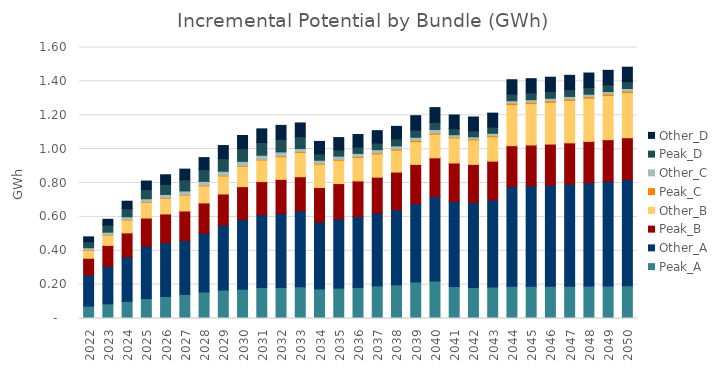
| Category | Peak_A | Other_A | Peak_B | Other_B | Peak_C | Other_C | Peak_D | Other_D |
|---|---|---|---|---|---|---|---|---|
| 2022.0 | 0.074 | 0.183 | 0.099 | 0.047 | 0.002 | 0.013 | 0.035 | 0.029 |
| 2023.0 | 0.087 | 0.221 | 0.124 | 0.06 | 0.002 | 0.015 | 0.042 | 0.034 |
| 2024.0 | 0.101 | 0.262 | 0.142 | 0.076 | 0.003 | 0.017 | 0.048 | 0.044 |
| 2025.0 | 0.118 | 0.309 | 0.166 | 0.092 | 0.003 | 0.019 | 0.054 | 0.05 |
| 2026.0 | 0.13 | 0.318 | 0.17 | 0.092 | 0.003 | 0.02 | 0.06 | 0.057 |
| 2027.0 | 0.142 | 0.318 | 0.174 | 0.093 | 0.004 | 0.021 | 0.065 | 0.064 |
| 2028.0 | 0.157 | 0.348 | 0.178 | 0.101 | 0.004 | 0.023 | 0.07 | 0.071 |
| 2029.0 | 0.168 | 0.384 | 0.183 | 0.106 | 0.004 | 0.024 | 0.075 | 0.077 |
| 2030.0 | 0.173 | 0.411 | 0.194 | 0.121 | 0.004 | 0.024 | 0.075 | 0.078 |
| 2031.0 | 0.183 | 0.43 | 0.196 | 0.127 | 0.005 | 0.024 | 0.075 | 0.081 |
| 2032.0 | 0.183 | 0.437 | 0.201 | 0.133 | 0.005 | 0.024 | 0.075 | 0.082 |
| 2033.0 | 0.187 | 0.448 | 0.201 | 0.144 | 0.005 | 0.018 | 0.069 | 0.081 |
| 2034.0 | 0.175 | 0.394 | 0.204 | 0.138 | 0.005 | 0.018 | 0.038 | 0.074 |
| 2035.0 | 0.179 | 0.408 | 0.209 | 0.138 | 0.006 | 0.019 | 0.037 | 0.073 |
| 2036.0 | 0.184 | 0.417 | 0.211 | 0.138 | 0.006 | 0.019 | 0.038 | 0.073 |
| 2037.0 | 0.192 | 0.43 | 0.212 | 0.138 | 0.006 | 0.019 | 0.039 | 0.073 |
| 2038.0 | 0.199 | 0.444 | 0.222 | 0.129 | 0.006 | 0.019 | 0.041 | 0.074 |
| 2039.0 | 0.216 | 0.464 | 0.23 | 0.134 | 0.007 | 0.02 | 0.042 | 0.085 |
| 2040.0 | 0.222 | 0.499 | 0.228 | 0.139 | 0.007 | 0.021 | 0.042 | 0.087 |
| 2041.0 | 0.189 | 0.502 | 0.226 | 0.148 | 0.005 | 0.014 | 0.036 | 0.081 |
| 2042.0 | 0.183 | 0.502 | 0.224 | 0.144 | 0.006 | 0.013 | 0.035 | 0.082 |
| 2043.0 | 0.185 | 0.514 | 0.229 | 0.144 | 0.006 | 0.014 | 0.036 | 0.083 |
| 2044.0 | 0.19 | 0.59 | 0.24 | 0.242 | 0.008 | 0.015 | 0.04 | 0.084 |
| 2045.0 | 0.19 | 0.593 | 0.241 | 0.244 | 0.008 | 0.015 | 0.04 | 0.084 |
| 2046.0 | 0.191 | 0.597 | 0.242 | 0.247 | 0.008 | 0.015 | 0.04 | 0.084 |
| 2047.0 | 0.191 | 0.603 | 0.243 | 0.25 | 0.008 | 0.015 | 0.04 | 0.085 |
| 2048.0 | 0.192 | 0.61 | 0.244 | 0.255 | 0.009 | 0.015 | 0.04 | 0.085 |
| 2049.0 | 0.192 | 0.618 | 0.245 | 0.26 | 0.009 | 0.015 | 0.04 | 0.085 |
| 2050.0 | 0.193 | 0.628 | 0.247 | 0.266 | 0.009 | 0.015 | 0.04 | 0.086 |